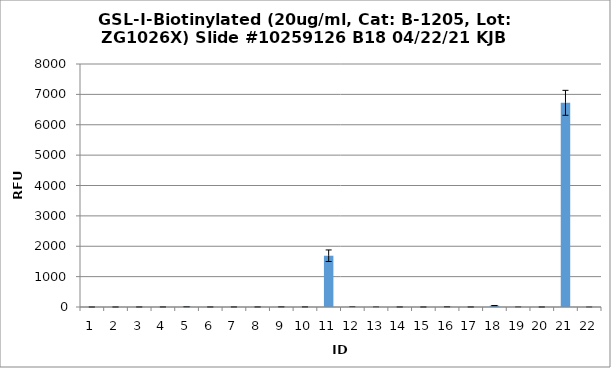
| Category | Series 0 |
|---|---|
| 0 | 0 |
| 1 | 1 |
| 2 | 1.5 |
| 3 | 2.25 |
| 4 | 9 |
| 5 | 1.75 |
| 6 | 2.25 |
| 7 | 2.5 |
| 8 | 6.25 |
| 9 | 4.5 |
| 10 | 1688 |
| 11 | 2.5 |
| 12 | 1.75 |
| 13 | 2.25 |
| 14 | 0.75 |
| 15 | 7.75 |
| 16 | 1.5 |
| 17 | 45.25 |
| 18 | 1.75 |
| 19 | 1 |
| 20 | 6722.25 |
| 21 | 0.25 |